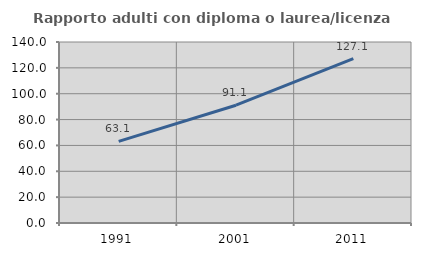
| Category | Rapporto adulti con diploma o laurea/licenza media  |
|---|---|
| 1991.0 | 63.131 |
| 2001.0 | 91.111 |
| 2011.0 | 127.083 |